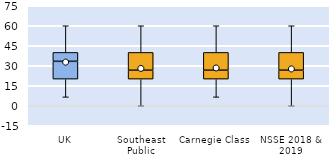
| Category | 25th | 50th | 75th |
|---|---|---|---|
| UK | 20 | 13.333 | 6.667 |
| Southeast Public | 20 | 6.667 | 13.333 |
| Carnegie Class | 20 | 6.667 | 13.333 |
| NSSE 2018 & 2019 | 20 | 6.667 | 13.333 |